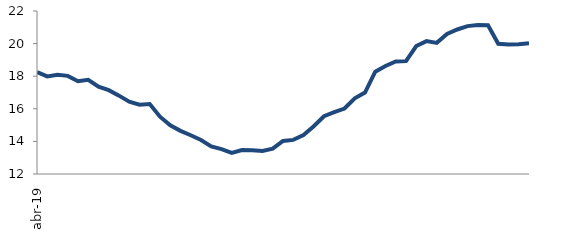
| Category | Series 0 |
|---|---|
| 2019-04-01 | 18.254 |
| 2019-05-01 | 17.988 |
| 2019-06-01 | 18.089 |
| 2019-07-01 | 18.02 |
| 2019-08-01 | 17.694 |
| 2019-09-01 | 17.777 |
| 2019-10-01 | 17.36 |
| 2019-11-01 | 17.14 |
| 2019-12-01 | 16.808 |
| 2020-01-01 | 16.434 |
| 2020-02-01 | 16.25 |
| 2020-03-01 | 16.293 |
| 2020-04-01 | 15.517 |
| 2020-05-01 | 14.987 |
| 2020-06-01 | 14.648 |
| 2020-07-01 | 14.379 |
| 2020-08-01 | 14.088 |
| 2020-09-01 | 13.698 |
| 2020-10-01 | 13.522 |
| 2020-11-01 | 13.294 |
| 2020-12-01 | 13.469 |
| 2021-01-01 | 13.453 |
| 2021-02-01 | 13.409 |
| 2021-03-01 | 13.556 |
| 2021-04-01 | 14.027 |
| 2021-05-01 | 14.092 |
| 2021-06-01 | 14.388 |
| 2021-07-01 | 14.927 |
| 2021-08-01 | 15.546 |
| 2021-09-01 | 15.791 |
| 2021-10-01 | 16.017 |
| 2021-11-01 | 16.641 |
| 2021-12-01 | 16.998 |
| 2022-01-01 | 18.278 |
| 2022-02-01 | 18.625 |
| 2022-03-01 | 18.903 |
| 2022-04-01 | 18.924 |
| 2022-05-01 | 19.85 |
| 2022-06-01 | 20.151 |
| 2022-07-01 | 20.044 |
| 2022-08-01 | 20.593 |
| 2022-09-01 | 20.866 |
| 2022-10-01 | 21.074 |
| 2022-11-01 | 21.136 |
| 2022-12-01 | 21.129 |
| 2023-01-01 | 19.993 |
| 2023-02-01 | 19.949 |
| 2023-03-01 | 19.953 |
| 2023-04-01 | 20.023 |